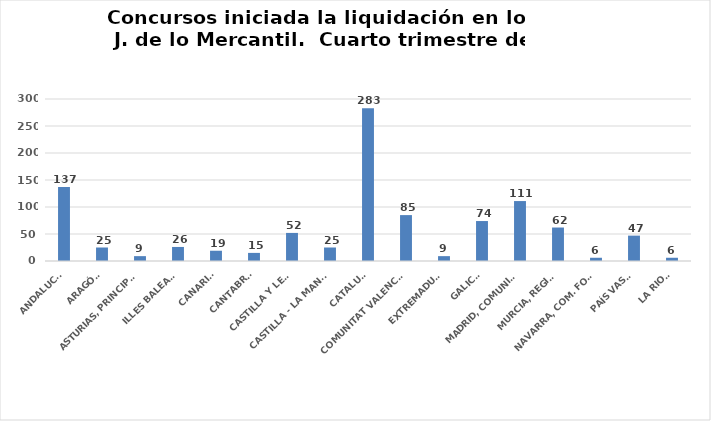
| Category | Series 0 |
|---|---|
| ANDALUCÍA | 137 |
| ARAGÓN | 25 |
| ASTURIAS, PRINCIPADO | 9 |
| ILLES BALEARS | 26 |
| CANARIAS | 19 |
| CANTABRIA | 15 |
| CASTILLA Y LEÓN | 52 |
| CASTILLA - LA MANCHA | 25 |
| CATALUÑA | 283 |
| COMUNITAT VALENCIANA | 85 |
| EXTREMADURA | 9 |
| GALICIA | 74 |
| MADRID, COMUNIDAD | 111 |
| MURCIA, REGIÓN | 62 |
| NAVARRA, COM. FORAL | 6 |
| PAÍS VASCO | 47 |
| LA RIOJA | 6 |